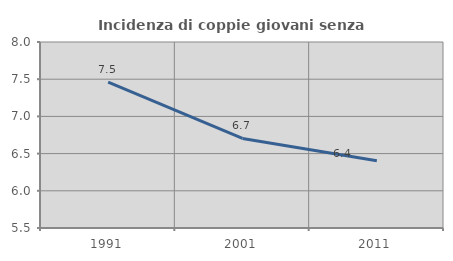
| Category | Incidenza di coppie giovani senza figli |
|---|---|
| 1991.0 | 7.461 |
| 2001.0 | 6.703 |
| 2011.0 | 6.403 |